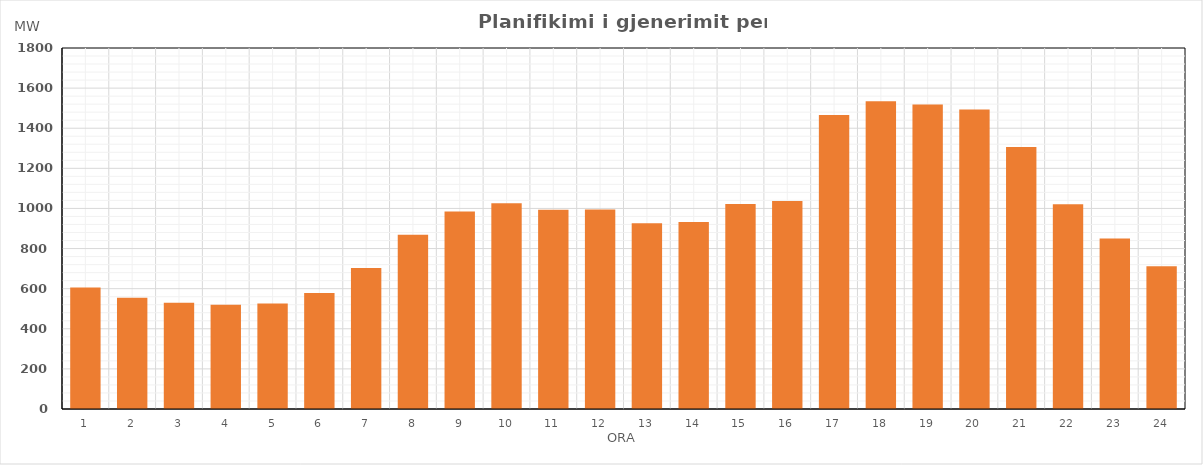
| Category | Max (MW) |
|---|---|
| 0 | 605.42 |
| 1 | 555.08 |
| 2 | 530.3 |
| 3 | 519.82 |
| 4 | 526.03 |
| 5 | 578.81 |
| 6 | 703.03 |
| 7 | 869.25 |
| 8 | 985.05 |
| 9 | 1026.49 |
| 10 | 994.08 |
| 11 | 994.69 |
| 12 | 925.72 |
| 13 | 931.96 |
| 14 | 1021.94 |
| 15 | 1037.5 |
| 16 | 1465.71 |
| 17 | 1534.38 |
| 18 | 1518.36 |
| 19 | 1492.84 |
| 20 | 1306.11 |
| 21 | 1020.94 |
| 22 | 850.2 |
| 23 | 711.75 |